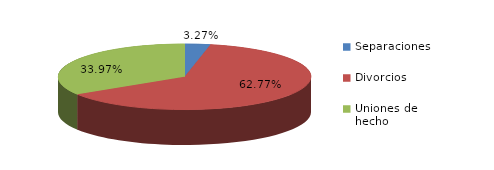
| Category | Series 0 |
|---|---|
| Separaciones | 55 |
| Divorcios | 1057 |
| Uniones de hecho | 572 |